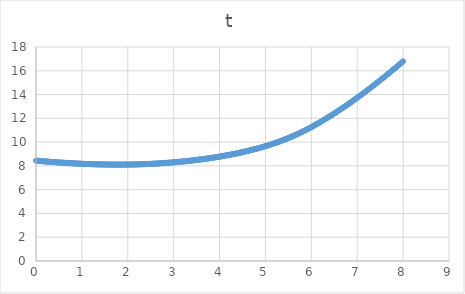
| Category | t |
|---|---|
| 0.0 | 8.443 |
| 0.016 | 8.437 |
| 0.032 | 8.432 |
| 0.048 | 8.426 |
| 0.064 | 8.421 |
| 0.08 | 8.415 |
| 0.096 | 8.41 |
| 0.112 | 8.404 |
| 0.128 | 8.399 |
| 0.14400000000000002 | 8.394 |
| 0.16000000000000003 | 8.389 |
| 0.17600000000000005 | 8.383 |
| 0.19200000000000006 | 8.378 |
| 0.20800000000000007 | 8.373 |
| 0.2240000000000001 | 8.368 |
| 0.2400000000000001 | 8.363 |
| 0.2560000000000001 | 8.358 |
| 0.27200000000000013 | 8.353 |
| 0.28800000000000014 | 8.348 |
| 0.30400000000000016 | 8.343 |
| 0.3200000000000002 | 8.339 |
| 0.3360000000000002 | 8.334 |
| 0.3520000000000002 | 8.329 |
| 0.3680000000000002 | 8.324 |
| 0.38400000000000023 | 8.32 |
| 0.40000000000000024 | 8.315 |
| 0.41600000000000026 | 8.311 |
| 0.4320000000000003 | 8.306 |
| 0.4480000000000003 | 8.302 |
| 0.4640000000000003 | 8.297 |
| 0.4800000000000003 | 8.293 |
| 0.49600000000000033 | 8.289 |
| 0.5120000000000003 | 8.284 |
| 0.5280000000000004 | 8.28 |
| 0.5440000000000004 | 8.276 |
| 0.5600000000000004 | 8.272 |
| 0.5760000000000004 | 8.268 |
| 0.5920000000000004 | 8.264 |
| 0.6080000000000004 | 8.26 |
| 0.6240000000000004 | 8.256 |
| 0.6400000000000005 | 8.252 |
| 0.6560000000000005 | 8.248 |
| 0.6720000000000005 | 8.244 |
| 0.6880000000000005 | 8.24 |
| 0.7040000000000005 | 8.237 |
| 0.7200000000000005 | 8.233 |
| 0.7360000000000005 | 8.23 |
| 0.7520000000000006 | 8.226 |
| 0.7680000000000006 | 8.222 |
| 0.7840000000000006 | 8.219 |
| 0.8000000000000006 | 8.216 |
| 0.8160000000000006 | 8.212 |
| 0.8320000000000006 | 8.209 |
| 0.8480000000000006 | 8.206 |
| 0.8640000000000007 | 8.202 |
| 0.8800000000000007 | 8.199 |
| 0.8960000000000007 | 8.196 |
| 0.9120000000000007 | 8.193 |
| 0.9280000000000007 | 8.19 |
| 0.9440000000000007 | 8.187 |
| 0.9600000000000007 | 8.184 |
| 0.9760000000000008 | 8.181 |
| 0.9920000000000008 | 8.178 |
| 1.0080000000000007 | 8.176 |
| 1.0240000000000007 | 8.173 |
| 1.0400000000000007 | 8.17 |
| 1.0560000000000007 | 8.168 |
| 1.0720000000000007 | 8.165 |
| 1.0880000000000007 | 8.163 |
| 1.1040000000000008 | 8.16 |
| 1.1200000000000008 | 8.158 |
| 1.1360000000000008 | 8.155 |
| 1.1520000000000008 | 8.153 |
| 1.1680000000000008 | 8.151 |
| 1.1840000000000008 | 8.149 |
| 1.2000000000000008 | 8.147 |
| 1.2160000000000009 | 8.144 |
| 1.2320000000000009 | 8.142 |
| 1.2480000000000009 | 8.14 |
| 1.264000000000001 | 8.139 |
| 1.280000000000001 | 8.137 |
| 1.296000000000001 | 8.135 |
| 1.312000000000001 | 8.133 |
| 1.328000000000001 | 8.131 |
| 1.344000000000001 | 8.13 |
| 1.360000000000001 | 8.128 |
| 1.376000000000001 | 8.127 |
| 1.392000000000001 | 8.125 |
| 1.408000000000001 | 8.124 |
| 1.424000000000001 | 8.122 |
| 1.440000000000001 | 8.121 |
| 1.456000000000001 | 8.12 |
| 1.472000000000001 | 8.119 |
| 1.488000000000001 | 8.118 |
| 1.5040000000000011 | 8.117 |
| 1.5200000000000011 | 8.116 |
| 1.5360000000000011 | 8.115 |
| 1.5520000000000012 | 8.114 |
| 1.5680000000000012 | 8.113 |
| 1.5840000000000012 | 8.112 |
| 1.6000000000000012 | 8.111 |
| 1.6160000000000012 | 8.111 |
| 1.6320000000000012 | 8.11 |
| 1.6480000000000012 | 8.11 |
| 1.6640000000000013 | 8.109 |
| 1.6800000000000013 | 8.109 |
| 1.6960000000000013 | 8.108 |
| 1.7120000000000013 | 8.108 |
| 1.7280000000000013 | 8.108 |
| 1.7440000000000013 | 8.107 |
| 1.7600000000000013 | 8.107 |
| 1.7760000000000014 | 8.107 |
| 1.7920000000000014 | 8.107 |
| 1.8080000000000014 | 8.107 |
| 1.8240000000000014 | 8.107 |
| 1.8400000000000014 | 8.108 |
| 1.8560000000000014 | 8.108 |
| 1.8720000000000014 | 8.108 |
| 1.8880000000000015 | 8.109 |
| 1.9040000000000015 | 8.109 |
| 1.9200000000000015 | 8.11 |
| 1.9360000000000015 | 8.11 |
| 1.9520000000000015 | 8.111 |
| 1.9680000000000015 | 8.111 |
| 1.9840000000000015 | 8.112 |
| 2.0000000000000013 | 8.113 |
| 2.0160000000000013 | 8.114 |
| 2.0320000000000014 | 8.115 |
| 2.0480000000000014 | 8.116 |
| 2.0640000000000014 | 8.117 |
| 2.0800000000000014 | 8.118 |
| 2.0960000000000014 | 8.119 |
| 2.1120000000000014 | 8.12 |
| 2.1280000000000014 | 8.122 |
| 2.1440000000000015 | 8.123 |
| 2.1600000000000015 | 8.125 |
| 2.1760000000000015 | 8.126 |
| 2.1920000000000015 | 8.128 |
| 2.2080000000000015 | 8.129 |
| 2.2240000000000015 | 8.131 |
| 2.2400000000000015 | 8.133 |
| 2.2560000000000016 | 8.135 |
| 2.2720000000000016 | 8.137 |
| 2.2880000000000016 | 8.139 |
| 2.3040000000000016 | 8.141 |
| 2.3200000000000016 | 8.143 |
| 2.3360000000000016 | 8.145 |
| 2.3520000000000016 | 8.147 |
| 2.3680000000000017 | 8.15 |
| 2.3840000000000017 | 8.152 |
| 2.4000000000000017 | 8.155 |
| 2.4160000000000017 | 8.157 |
| 2.4320000000000017 | 8.16 |
| 2.4480000000000017 | 8.162 |
| 2.4640000000000017 | 8.165 |
| 2.4800000000000018 | 8.168 |
| 2.4960000000000018 | 8.171 |
| 2.512000000000002 | 8.174 |
| 2.528000000000002 | 8.177 |
| 2.544000000000002 | 8.18 |
| 2.560000000000002 | 8.183 |
| 2.576000000000002 | 8.186 |
| 2.592000000000002 | 8.19 |
| 2.608000000000002 | 8.193 |
| 2.624000000000002 | 8.196 |
| 2.640000000000002 | 8.2 |
| 2.656000000000002 | 8.203 |
| 2.672000000000002 | 8.207 |
| 2.688000000000002 | 8.211 |
| 2.704000000000002 | 8.215 |
| 2.720000000000002 | 8.218 |
| 2.736000000000002 | 8.222 |
| 2.752000000000002 | 8.226 |
| 2.768000000000002 | 8.231 |
| 2.784000000000002 | 8.235 |
| 2.800000000000002 | 8.239 |
| 2.816000000000002 | 8.243 |
| 2.832000000000002 | 8.248 |
| 2.848000000000002 | 8.252 |
| 2.864000000000002 | 8.257 |
| 2.880000000000002 | 8.261 |
| 2.896000000000002 | 8.266 |
| 2.912000000000002 | 8.271 |
| 2.928000000000002 | 8.275 |
| 2.944000000000002 | 8.28 |
| 2.960000000000002 | 8.285 |
| 2.976000000000002 | 8.29 |
| 2.992000000000002 | 8.295 |
| 3.0080000000000022 | 8.301 |
| 3.0240000000000022 | 8.306 |
| 3.0400000000000023 | 8.311 |
| 3.0560000000000023 | 8.317 |
| 3.0720000000000023 | 8.322 |
| 3.0880000000000023 | 8.328 |
| 3.1040000000000023 | 8.333 |
| 3.1200000000000023 | 8.339 |
| 3.1360000000000023 | 8.345 |
| 3.1520000000000024 | 8.351 |
| 3.1680000000000024 | 8.357 |
| 3.1840000000000024 | 8.363 |
| 3.2000000000000024 | 8.369 |
| 3.2160000000000024 | 8.375 |
| 3.2320000000000024 | 8.381 |
| 3.2480000000000024 | 8.388 |
| 3.2640000000000025 | 8.394 |
| 3.2800000000000025 | 8.401 |
| 3.2960000000000025 | 8.407 |
| 3.3120000000000025 | 8.414 |
| 3.3280000000000025 | 8.421 |
| 3.3440000000000025 | 8.428 |
| 3.3600000000000025 | 8.434 |
| 3.3760000000000026 | 8.441 |
| 3.3920000000000026 | 8.448 |
| 3.4080000000000026 | 8.456 |
| 3.4240000000000026 | 8.463 |
| 3.4400000000000026 | 8.47 |
| 3.4560000000000026 | 8.478 |
| 3.4720000000000026 | 8.485 |
| 3.4880000000000027 | 8.493 |
| 3.5040000000000027 | 8.5 |
| 3.5200000000000027 | 8.508 |
| 3.5360000000000027 | 8.516 |
| 3.5520000000000027 | 8.524 |
| 3.5680000000000027 | 8.532 |
| 3.5840000000000027 | 8.54 |
| 3.6000000000000028 | 8.548 |
| 3.6160000000000028 | 8.556 |
| 3.632000000000003 | 8.564 |
| 3.648000000000003 | 8.573 |
| 3.664000000000003 | 8.581 |
| 3.680000000000003 | 8.59 |
| 3.696000000000003 | 8.598 |
| 3.712000000000003 | 8.607 |
| 3.728000000000003 | 8.616 |
| 3.744000000000003 | 8.625 |
| 3.760000000000003 | 8.634 |
| 3.776000000000003 | 8.643 |
| 3.792000000000003 | 8.652 |
| 3.808000000000003 | 8.661 |
| 3.824000000000003 | 8.671 |
| 3.840000000000003 | 8.68 |
| 3.856000000000003 | 8.69 |
| 3.872000000000003 | 8.699 |
| 3.888000000000003 | 8.709 |
| 3.904000000000003 | 8.719 |
| 3.920000000000003 | 8.729 |
| 3.936000000000003 | 8.739 |
| 3.952000000000003 | 8.749 |
| 3.968000000000003 | 8.759 |
| 3.984000000000003 | 8.769 |
| 4.000000000000003 | 8.78 |
| 4.016000000000003 | 8.79 |
| 4.032000000000003 | 8.801 |
| 4.048000000000003 | 8.811 |
| 4.064000000000003 | 8.822 |
| 4.080000000000003 | 8.833 |
| 4.096000000000003 | 8.844 |
| 4.112000000000003 | 8.855 |
| 4.128000000000003 | 8.866 |
| 4.144000000000003 | 8.878 |
| 4.160000000000003 | 8.889 |
| 4.176000000000003 | 8.9 |
| 4.192000000000003 | 8.912 |
| 4.208000000000003 | 8.924 |
| 4.224000000000003 | 8.936 |
| 4.240000000000003 | 8.947 |
| 4.256000000000003 | 8.959 |
| 4.272000000000003 | 8.972 |
| 4.288000000000003 | 8.984 |
| 4.304000000000003 | 8.996 |
| 4.320000000000003 | 9.009 |
| 4.336000000000003 | 9.021 |
| 4.352000000000003 | 9.034 |
| 4.368000000000003 | 9.047 |
| 4.384000000000003 | 9.059 |
| 4.400000000000003 | 9.072 |
| 4.416000000000003 | 9.086 |
| 4.432000000000003 | 9.099 |
| 4.448000000000003 | 9.112 |
| 4.464000000000003 | 9.126 |
| 4.480000000000003 | 9.139 |
| 4.496000000000003 | 9.153 |
| 4.512000000000003 | 9.167 |
| 4.528000000000003 | 9.181 |
| 4.544000000000003 | 9.195 |
| 4.560000000000003 | 9.209 |
| 4.576000000000003 | 9.224 |
| 4.592000000000003 | 9.238 |
| 4.608000000000003 | 9.253 |
| 4.624000000000003 | 9.268 |
| 4.640000000000003 | 9.283 |
| 4.656000000000003 | 9.298 |
| 4.672000000000003 | 9.313 |
| 4.688000000000003 | 9.328 |
| 4.704000000000003 | 9.344 |
| 4.720000000000003 | 9.359 |
| 4.736000000000003 | 9.375 |
| 4.752000000000003 | 9.391 |
| 4.768000000000003 | 9.407 |
| 4.784000000000003 | 9.423 |
| 4.800000000000003 | 9.44 |
| 4.816000000000003 | 9.456 |
| 4.832000000000003 | 9.473 |
| 4.848000000000003 | 9.49 |
| 4.864000000000003 | 9.507 |
| 4.8800000000000034 | 9.524 |
| 4.8960000000000035 | 9.541 |
| 4.9120000000000035 | 9.559 |
| 4.9280000000000035 | 9.577 |
| 4.9440000000000035 | 9.595 |
| 4.9600000000000035 | 9.613 |
| 4.9760000000000035 | 9.631 |
| 4.9920000000000035 | 9.649 |
| 5.008000000000004 | 9.668 |
| 5.024000000000004 | 9.687 |
| 5.040000000000004 | 9.706 |
| 5.056000000000004 | 9.725 |
| 5.072000000000004 | 9.744 |
| 5.088000000000004 | 9.764 |
| 5.104000000000004 | 9.784 |
| 5.120000000000004 | 9.804 |
| 5.136000000000004 | 9.824 |
| 5.152000000000004 | 9.844 |
| 5.168000000000004 | 9.865 |
| 5.184000000000004 | 9.886 |
| 5.200000000000004 | 9.907 |
| 5.216000000000004 | 9.928 |
| 5.232000000000004 | 9.949 |
| 5.248000000000004 | 9.971 |
| 5.264000000000004 | 9.993 |
| 5.280000000000004 | 10.015 |
| 5.296000000000004 | 10.037 |
| 5.312000000000004 | 10.06 |
| 5.328000000000004 | 10.083 |
| 5.344000000000004 | 10.106 |
| 5.360000000000004 | 10.129 |
| 5.376000000000004 | 10.153 |
| 5.392000000000004 | 10.176 |
| 5.408000000000004 | 10.2 |
| 5.424000000000004 | 10.225 |
| 5.440000000000004 | 10.249 |
| 5.456000000000004 | 10.274 |
| 5.472000000000004 | 10.299 |
| 5.488000000000004 | 10.324 |
| 5.504000000000004 | 10.349 |
| 5.520000000000004 | 10.375 |
| 5.536000000000004 | 10.401 |
| 5.552000000000004 | 10.427 |
| 5.568000000000004 | 10.454 |
| 5.584000000000004 | 10.481 |
| 5.600000000000004 | 10.508 |
| 5.616000000000004 | 10.535 |
| 5.632000000000004 | 10.562 |
| 5.648000000000004 | 10.59 |
| 5.664000000000004 | 10.618 |
| 5.680000000000004 | 10.646 |
| 5.696000000000004 | 10.675 |
| 5.712000000000004 | 10.704 |
| 5.728000000000004 | 10.733 |
| 5.744000000000004 | 10.762 |
| 5.760000000000004 | 10.791 |
| 5.776000000000004 | 10.821 |
| 5.792000000000004 | 10.851 |
| 5.808000000000004 | 10.881 |
| 5.824000000000004 | 10.912 |
| 5.840000000000004 | 10.943 |
| 5.856000000000004 | 10.974 |
| 5.872000000000004 | 11.005 |
| 5.888000000000004 | 11.037 |
| 5.904000000000004 | 11.068 |
| 5.920000000000004 | 11.1 |
| 5.936000000000004 | 11.132 |
| 5.952000000000004 | 11.165 |
| 5.968000000000004 | 11.198 |
| 5.984000000000004 | 11.231 |
| 6.000000000000004 | 11.264 |
| 6.0160000000000045 | 11.297 |
| 6.0320000000000045 | 11.331 |
| 6.0480000000000045 | 11.365 |
| 6.0640000000000045 | 11.399 |
| 6.0800000000000045 | 11.433 |
| 6.0960000000000045 | 11.468 |
| 6.1120000000000045 | 11.503 |
| 6.1280000000000046 | 11.538 |
| 6.144000000000005 | 11.573 |
| 6.160000000000005 | 11.608 |
| 6.176000000000005 | 11.644 |
| 6.192000000000005 | 11.68 |
| 6.208000000000005 | 11.716 |
| 6.224000000000005 | 11.752 |
| 6.240000000000005 | 11.789 |
| 6.256000000000005 | 11.825 |
| 6.272000000000005 | 11.862 |
| 6.288000000000005 | 11.899 |
| 6.304000000000005 | 11.937 |
| 6.320000000000005 | 11.974 |
| 6.336000000000005 | 12.012 |
| 6.352000000000005 | 12.05 |
| 6.368000000000005 | 12.088 |
| 6.384000000000005 | 12.126 |
| 6.400000000000005 | 12.165 |
| 6.416000000000005 | 12.203 |
| 6.432000000000005 | 12.242 |
| 6.448000000000005 | 12.281 |
| 6.464000000000005 | 12.32 |
| 6.480000000000005 | 12.36 |
| 6.496000000000005 | 12.399 |
| 6.512000000000005 | 12.439 |
| 6.528000000000005 | 12.479 |
| 6.544000000000005 | 12.519 |
| 6.560000000000005 | 12.56 |
| 6.576000000000005 | 12.6 |
| 6.592000000000005 | 12.641 |
| 6.608000000000005 | 12.682 |
| 6.624000000000005 | 12.723 |
| 6.640000000000005 | 12.764 |
| 6.656000000000005 | 12.805 |
| 6.672000000000005 | 12.847 |
| 6.688000000000005 | 12.888 |
| 6.704000000000005 | 12.93 |
| 6.720000000000005 | 12.972 |
| 6.736000000000005 | 13.014 |
| 6.752000000000005 | 13.057 |
| 6.768000000000005 | 13.099 |
| 6.784000000000005 | 13.142 |
| 6.800000000000005 | 13.184 |
| 6.816000000000005 | 13.227 |
| 6.832000000000005 | 13.271 |
| 6.848000000000005 | 13.314 |
| 6.864000000000005 | 13.357 |
| 6.880000000000005 | 13.401 |
| 6.896000000000005 | 13.445 |
| 6.912000000000005 | 13.488 |
| 6.928000000000005 | 13.533 |
| 6.944000000000005 | 13.577 |
| 6.960000000000005 | 13.621 |
| 6.976000000000005 | 13.666 |
| 6.992000000000005 | 13.71 |
| 7.008000000000005 | 13.755 |
| 7.024000000000005 | 13.8 |
| 7.040000000000005 | 13.845 |
| 7.056000000000005 | 13.89 |
| 7.072000000000005 | 13.936 |
| 7.088000000000005 | 13.981 |
| 7.104000000000005 | 14.027 |
| 7.120000000000005 | 14.073 |
| 7.1360000000000054 | 14.118 |
| 7.1520000000000055 | 14.165 |
| 7.1680000000000055 | 14.211 |
| 7.1840000000000055 | 14.257 |
| 7.2000000000000055 | 14.304 |
| 7.2160000000000055 | 14.35 |
| 7.2320000000000055 | 14.397 |
| 7.2480000000000055 | 14.444 |
| 7.264000000000006 | 14.491 |
| 7.280000000000006 | 14.538 |
| 7.296000000000006 | 14.586 |
| 7.312000000000006 | 14.633 |
| 7.328000000000006 | 14.681 |
| 7.344000000000006 | 14.728 |
| 7.360000000000006 | 14.776 |
| 7.376000000000006 | 14.824 |
| 7.392000000000006 | 14.872 |
| 7.408000000000006 | 14.921 |
| 7.424000000000006 | 14.969 |
| 7.440000000000006 | 15.018 |
| 7.456000000000006 | 15.066 |
| 7.472000000000006 | 15.115 |
| 7.488000000000006 | 15.164 |
| 7.504000000000006 | 15.213 |
| 7.520000000000006 | 15.262 |
| 7.536000000000006 | 15.311 |
| 7.552000000000006 | 15.361 |
| 7.568000000000006 | 15.41 |
| 7.584000000000006 | 15.46 |
| 7.600000000000006 | 15.51 |
| 7.616000000000006 | 15.56 |
| 7.632000000000006 | 15.61 |
| 7.648000000000006 | 15.66 |
| 7.664000000000006 | 15.711 |
| 7.680000000000006 | 15.761 |
| 7.696000000000006 | 15.812 |
| 7.712000000000006 | 15.862 |
| 7.728000000000006 | 15.913 |
| 7.744000000000006 | 15.964 |
| 7.760000000000006 | 16.015 |
| 7.776000000000006 | 16.067 |
| 7.792000000000006 | 16.118 |
| 7.808000000000006 | 16.169 |
| 7.824000000000006 | 16.221 |
| 7.840000000000006 | 16.273 |
| 7.856000000000006 | 16.325 |
| 7.872000000000006 | 16.377 |
| 7.888000000000006 | 16.429 |
| 7.904000000000006 | 16.481 |
| 7.920000000000006 | 16.533 |
| 7.936000000000006 | 16.586 |
| 7.952000000000006 | 16.638 |
| 7.968000000000006 | 16.691 |
| 7.984000000000006 | 16.744 |
| 8.000000000000005 | 16.797 |